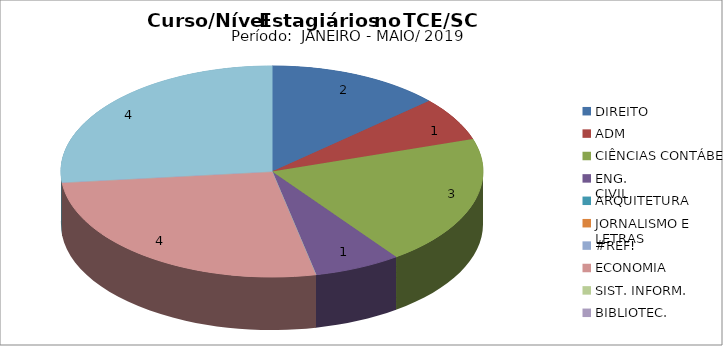
| Category | Series 0 |
|---|---|
| DIREITO | 2 |
| ADM | 1 |
| CIÊNCIAS CONTÁBEIS | 3 |
| ENG.
CIVIL | 1 |
| ARQUITETURA | 0 |
| JORNALISMO E LETRAS
 | 0 |
| #REF! | 0 |
| ECONOMIA | 4 |
| SIST. INFORM. | 0 |
| BIBLIOTEC. | 0 |
| NÍVEL
MÉDIO  | 4 |